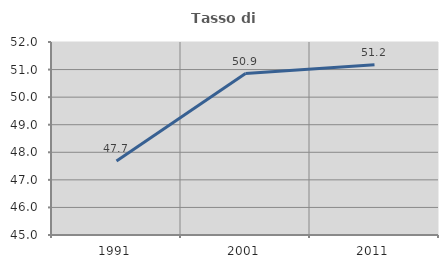
| Category | Tasso di occupazione   |
|---|---|
| 1991.0 | 47.681 |
| 2001.0 | 50.854 |
| 2011.0 | 51.176 |